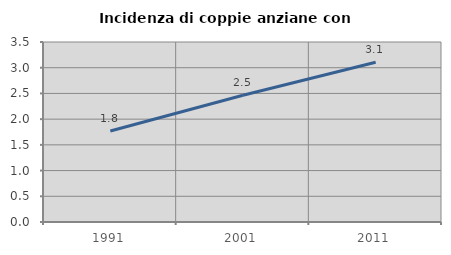
| Category | Incidenza di coppie anziane con figli |
|---|---|
| 1991.0 | 1.769 |
| 2001.0 | 2.464 |
| 2011.0 | 3.105 |